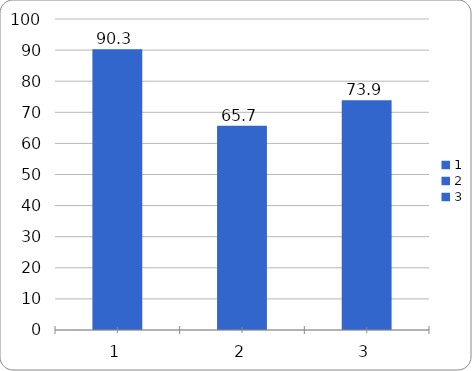
| Category | Series 0 |
|---|---|
| 0 | 90.3 |
| 1 | 65.7 |
| 2 | 73.9 |